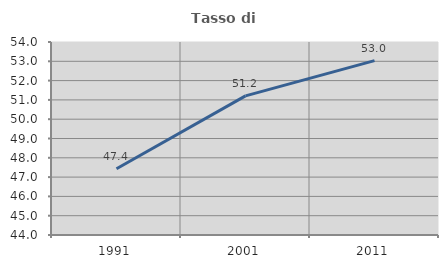
| Category | Tasso di occupazione   |
|---|---|
| 1991.0 | 47.43 |
| 2001.0 | 51.207 |
| 2011.0 | 53.036 |